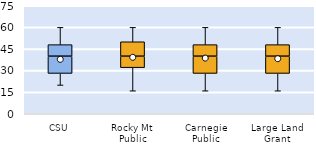
| Category | 25th | 50th | 75th |
|---|---|---|---|
| CSU | 28 | 12 | 8 |
| Rocky Mt Public | 32 | 8 | 10 |
| Carnegie Public | 28 | 12 | 8 |
| Large Land Grant | 28 | 12 | 8 |